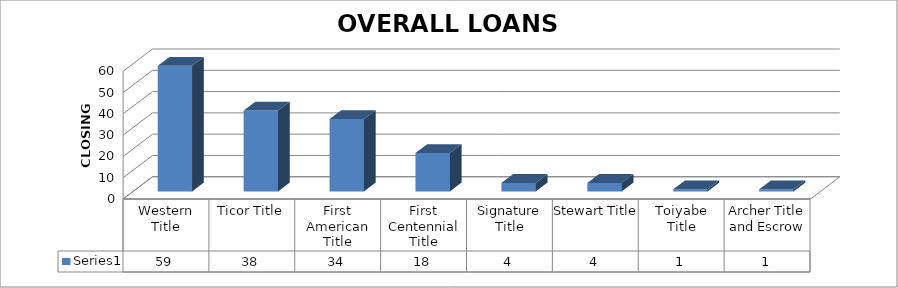
| Category | Series 0 |
|---|---|
| Western Title | 59 |
| Ticor Title | 38 |
| First American Title | 34 |
| First Centennial Title | 18 |
| Signature Title | 4 |
| Stewart Title | 4 |
| Toiyabe Title | 1 |
| Archer Title and Escrow | 1 |